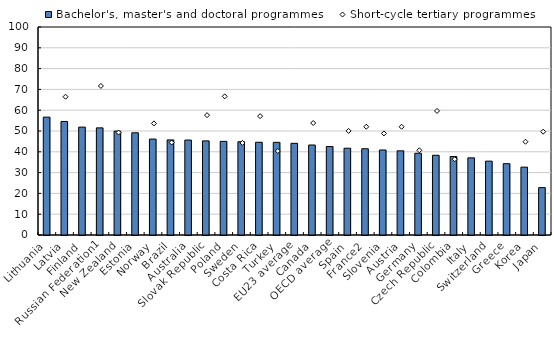
| Category | Bachelor's, master's and doctoral programmes |
|---|---|
| Lithuania | 56.668 |
| Latvia | 54.59 |
| Finland | 51.877 |
| Russian Federation1 | 51.509 |
| New Zealand | 49.958 |
| Estonia | 49.133 |
| Norway | 46.118 |
| Brazil | 45.709 |
| Australia | 45.646 |
| Slovak Republic | 45.252 |
| Poland | 45.012 |
| Sweden | 44.833 |
| Costa Rica | 44.589 |
| Turkey | 44.545 |
| EU23 average | 44.06 |
| Canada | 43.277 |
| OECD average | 42.532 |
| Spain | 41.707 |
| France2 | 41.469 |
| Slovenia | 40.866 |
| Austria | 40.474 |
| Germany | 39.303 |
| Czech Republic | 38.34 |
| Colombia | 37.73 |
| Italy | 37.093 |
| Switzerland | 35.508 |
| Greece | 34.289 |
| Korea | 32.627 |
| Japan | 22.777 |